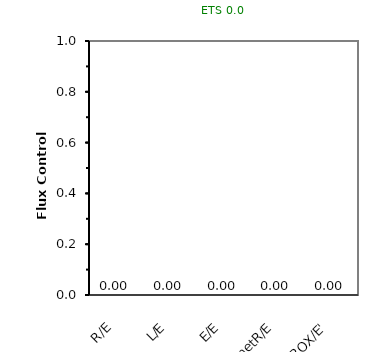
| Category | ETS 0,0 |
|---|---|
| R/E | 0 |
| L/E | 0 |
| E/E | 0 |
| netR/E | 0 |
| ROX/E' | 0 |